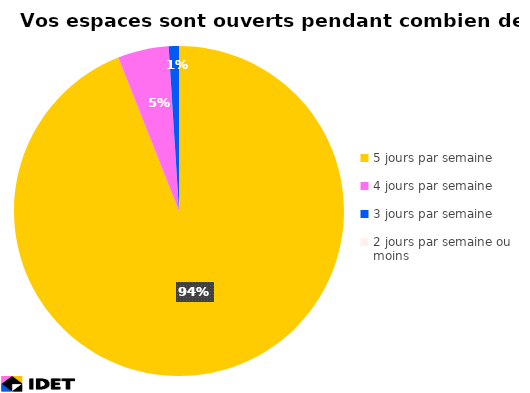
| Category | Series 1 |
|---|---|
| 5 jours par semaine | 94 |
| 4 jours par semaine | 5 |
| 3 jours par semaine | 1 |
| 2 jours par semaine ou moins  | 0 |